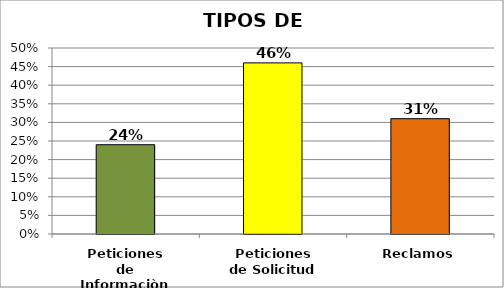
| Category | % |
|---|---|
| Peticiones de Informaciòn | 0.24 |
| Peticiones de Solicitud | 0.46 |
| Reclamos | 0.31 |